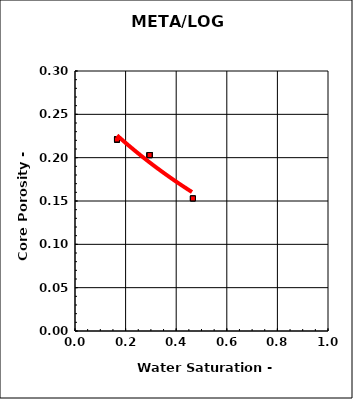
| Category | Series 0 |
|---|---|
| 0.466 | 0.153 |
| 0.466 | 0.153 |
| 0.466 | 0.153 |
| 0.295 | 0.203 |
| 0.295 | 0.203 |
| 0.295 | 0.203 |
| 0.295 | 0.203 |
| 0.295 | 0.203 |
| 0.295 | 0.203 |
| 0.295 | 0.203 |
| 0.166 | 0.221 |
| 0.166 | 0.221 |
| 0.166 | 0.221 |
| 0.166 | 0.221 |
| 0.166 | 0.221 |
| 0.166 | 0.221 |
| 0.166 | 0.221 |
| 0.166 | 0.221 |